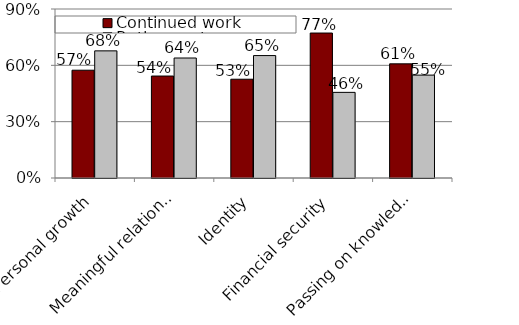
| Category | Continued work | Retirement |
|---|---|---|
| Personal growth | 0.574 | 0.677 |
| Meaningful relationships | 0.543 | 0.639 |
| Identity | 0.526 | 0.652 |
| Financial security | 0.772 | 0.456 |
| Passing on knowledge and values | 0.608 | 0.548 |